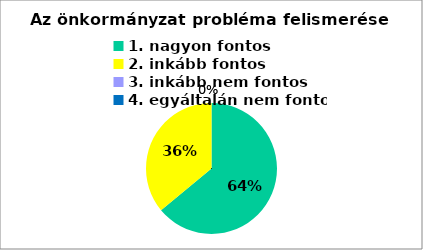
| Category | Series 0 | Series 1 |
|---|---|---|
| 1. nagyon fontos | 16 | 64 |
| 2. inkább fontos | 9 | 36 |
| 3. inkább nem fontos | 0 | 0 |
| 4. egyáltalán nem fontos | 0 | 0 |